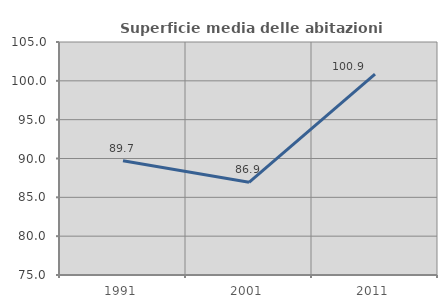
| Category | Superficie media delle abitazioni occupate |
|---|---|
| 1991.0 | 89.704 |
| 2001.0 | 86.935 |
| 2011.0 | 100.868 |